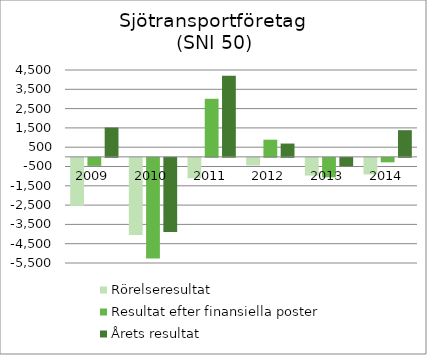
| Category | Rörelseresultat | Resultat efter finansiella poster | Årets resultat |
|---|---|---|---|
| 2009.0 | -2490.518 | -416.431 | 1520 |
| 2010.0 | -3993.031 | -5217.816 | -3845.881 |
| 2011.0 | -1054.89 | 3008 | 4206 |
| 2012.0 | -396.67 | 888.86 | 689.281 |
| 2013.0 | -920.448 | -1008.326 | -432.231 |
| 2014.0 | -859.04 | -231.797 | 1381.89 |